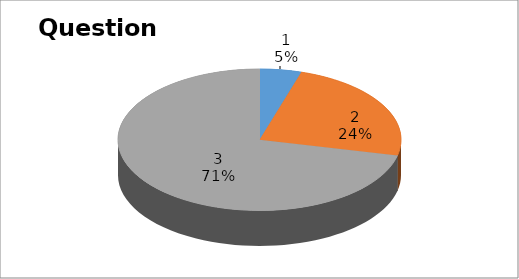
| Category | Series 0 |
|---|---|
| 0 | 2 |
| 1 | 10 |
| 2 | 30 |